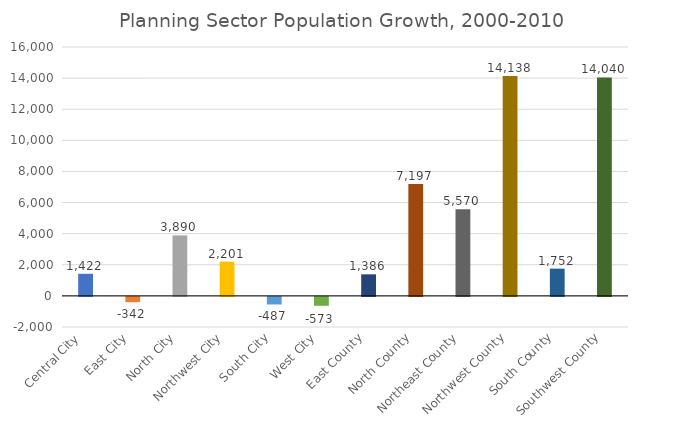
| Category | Total population |
|---|---|
| Central City  | 1422 |
| East City  | -342 |
| North City  | 3890 |
| Northwest City  | 2201 |
| South City  | -487 |
| West City  | -573 |
| East County  | 1386 |
| North County  | 7197 |
| Northeast County  | 5570 |
| Northwest County  | 14138 |
| South County  | 1752 |
| Southwest County  | 14040 |